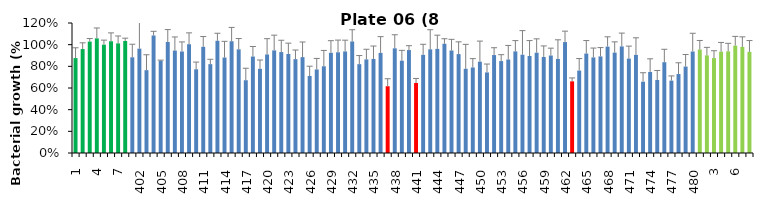
| Category | 8 h % |
|---|---|
| 1.0 | 0.876 |
| 2.0 | 0.96 |
| 3.0 | 1.029 |
| 4.0 | 1.058 |
| 5.0 | 1 |
| 6.0 | 1.032 |
| 7.0 | 1.012 |
| 8.0 | 1.034 |
| 401.0 | 0.883 |
| 402.0 | 0.963 |
| 403.0 | 0.765 |
| 404.0 | 1.085 |
| 405.0 | 0.852 |
| 406.0 | 1.024 |
| 407.0 | 0.946 |
| 408.0 | 0.937 |
| 409.0 | 1.004 |
| 410.0 | 0.773 |
| 411.0 | 0.98 |
| 412.0 | 0.82 |
| 413.0 | 1.036 |
| 414.0 | 0.881 |
| 415.0 | 1.032 |
| 416.0 | 0.957 |
| 417.0 | 0.672 |
| 418.0 | 0.891 |
| 419.0 | 0.777 |
| 420.0 | 0.91 |
| 421.0 | 0.947 |
| 422.0 | 0.932 |
| 423.0 | 0.914 |
| 424.0 | 0.866 |
| 425.0 | 0.885 |
| 426.0 | 0.711 |
| 427.0 | 0.771 |
| 428.0 | 0.8 |
| 429.0 | 0.925 |
| 430.0 | 0.929 |
| 431.0 | 0.937 |
| 432.0 | 1.03 |
| 433.0 | 0.82 |
| 434.0 | 0.864 |
| 435.0 | 0.868 |
| 436.0 | 0.924 |
| 437.0 | 0.616 |
| 438.0 | 0.966 |
| 439.0 | 0.852 |
| 440.0 | 0.95 |
| 441.0 | 0.646 |
| 442.0 | 0.906 |
| 443.0 | 0.957 |
| 444.0 | 0.961 |
| 445.0 | 1.008 |
| 446.0 | 0.946 |
| 447.0 | 0.913 |
| 448.0 | 0.778 |
| 449.0 | 0.79 |
| 450.0 | 0.843 |
| 451.0 | 0.744 |
| 452.0 | 0.904 |
| 453.0 | 0.849 |
| 454.0 | 0.863 |
| 455.0 | 0.938 |
| 456.0 | 0.907 |
| 457.0 | 0.895 |
| 458.0 | 0.926 |
| 459.0 | 0.886 |
| 460.0 | 0.9 |
| 461.0 | 0.868 |
| 462.0 | 1.024 |
| 463.0 | 0.661 |
| 464.0 | 0.761 |
| 465.0 | 0.918 |
| 466.0 | 0.882 |
| 467.0 | 0.892 |
| 468.0 | 0.982 |
| 469.0 | 0.927 |
| 470.0 | 0.984 |
| 471.0 | 0.871 |
| 472.0 | 0.906 |
| 473.0 | 0.658 |
| 474.0 | 0.748 |
| 475.0 | 0.674 |
| 476.0 | 0.838 |
| 477.0 | 0.668 |
| 478.0 | 0.729 |
| 479.0 | 0.798 |
| 480.0 | 0.937 |
| 1.0 | 0.955 |
| 2.0 | 0.901 |
| 3.0 | 0.876 |
| 4.0 | 0.935 |
| 5.0 | 0.938 |
| 6.0 | 0.991 |
| 7.0 | 0.98 |
| 8.0 | 0.934 |